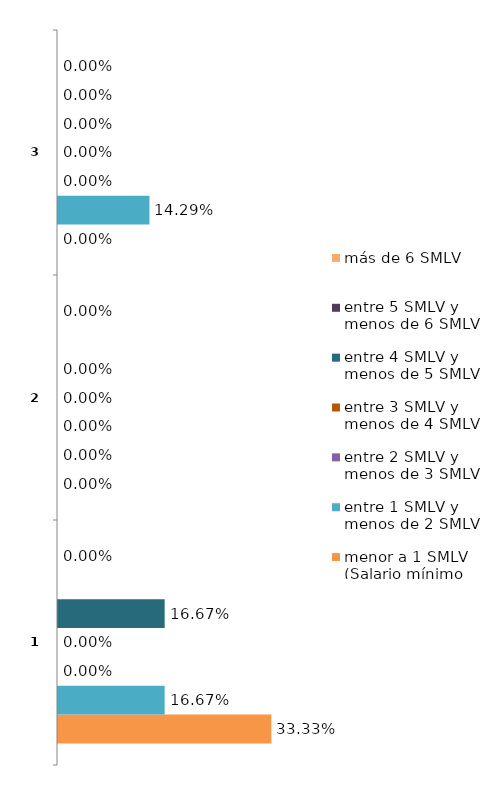
| Category | menor a 1 SMLV (Salario mínimo legal vigente) | entre 1 SMLV y menos de 2 SMLV | entre 2 SMLV y menos de 3 SMLV | entre 3 SMLV y menos de 4 SMLV | entre 4 SMLV y menos de 5 SMLV | entre 5 SMLV y menos de 6 SMLV | más de 6 SMLV |
|---|---|---|---|---|---|---|---|
| 0 | 0.333 | 0.167 | 0 | 0 | 0.167 | 0 | 0 |
| 1 | 0 | 0 | 0 | 0 | 0 | 0 | 0 |
| 2 | 0 | 0.143 | 0 | 0 | 0 | 0 | 0 |